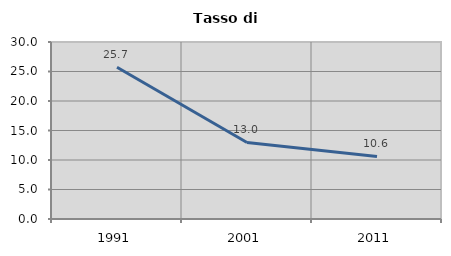
| Category | Tasso di disoccupazione   |
|---|---|
| 1991.0 | 25.727 |
| 2001.0 | 12.977 |
| 2011.0 | 10.602 |